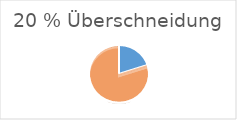
| Category | Series 0 |
|---|---|
| 0 | 20 |
| 1 | 80 |